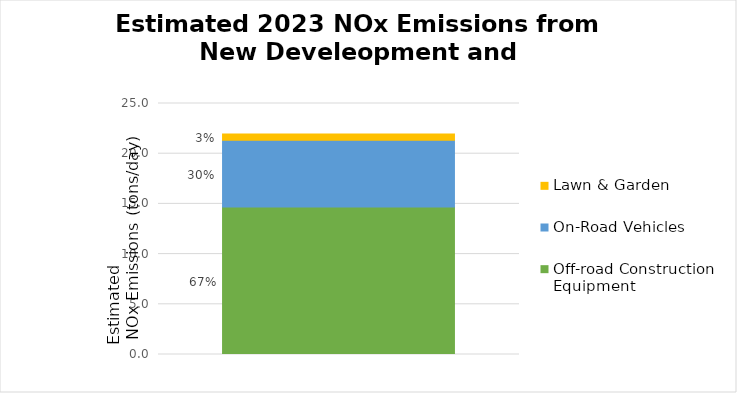
| Category | Off-road Construction Equipment | On-Road Vehicles | Lawn & Garden |
|---|---|---|---|
| 2023 NOx Emisions  | 14.701 | 6.635 | 0.635 |